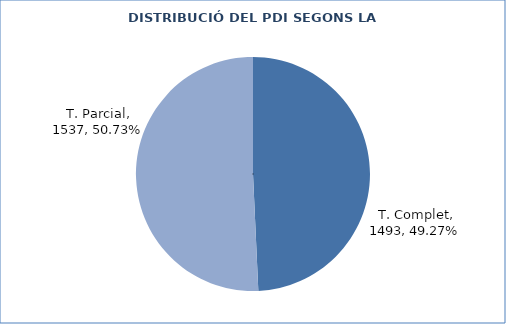
| Category | Series 0 |
|---|---|
| T. Complet | 1493 |
| T. Parcial | 1537 |